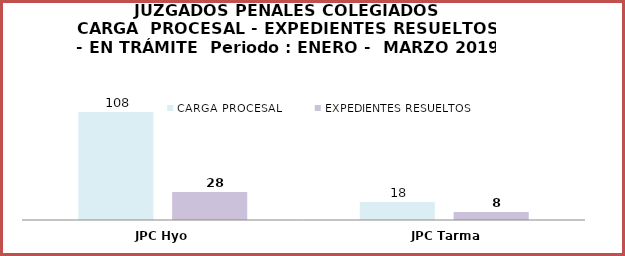
| Category | CARGA PROCESAL | EXPEDIENTES RESUELTOS |
|---|---|---|
| JPC Hyo | 108 | 28 |
| JPC Tarma | 18 | 8 |